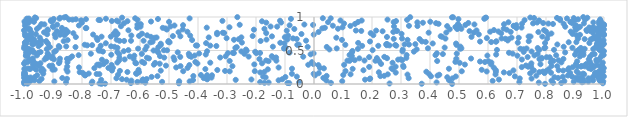
| Category | Series 0 |
|---|---|
| 0.4761831762998169 | 0.001 |
| -0.7329986514179211 | 0.002 |
| 0.7966682588284687 | 0.003 |
| 0.37144371999010345 | 0.004 |
| -0.7204422965552445 | 0.005 |
| -0.9878403852070654 | 0.006 |
| -0.9994848018403928 | 0.007 |
| 0.2604854030135903 | 0.008 |
| -0.73987213595592 | 0.009 |
| -0.46590606559162245 | 0.01 |
| 0.9959589332955084 | 0.011 |
| -0.7665202800155161 | 0.012 |
| -0.08530954791465736 | 0.013 |
| -0.6313558976180087 | 0.014 |
| -0.0912273567869117 | 0.015 |
| 0.8528263923291615 | 0.016 |
| 0.05836148076472211 | 0.017 |
| -0.1708466229633781 | 0.018 |
| 0.8242678834732179 | 0.019 |
| -0.581791832935564 | 0.02 |
| 0.7752205158450862 | 0.021 |
| -0.1564035391496722 | 0.022 |
| -0.8550766626551991 | 0.023 |
| 0.42271016923232363 | 0.024 |
| -0.05116092716713912 | 0.025 |
| 0.9243784206409622 | 0.026 |
| -0.9824514071251189 | 0.027 |
| 0.7082492126752002 | 0.028 |
| -0.185692559574249 | 0.029 |
| -0.999760023621199 | 0.03 |
| -0.6091591608109762 | 0.031 |
| -0.523763712618865 | 0.032 |
| 0.8957545234421641 | 0.033 |
| 0.9913670706943317 | 0.034 |
| -0.7644074813029114 | 0.035 |
| 0.9462475688852203 | 0.036 |
| 0.9298903179635305 | 0.037 |
| -0.8954163408834829 | 0.038 |
| -0.42886680125371224 | 0.039 |
| 0.9974288219927818 | 0.04 |
| -0.46478855307577843 | 0.041 |
| 0.09733046694445732 | 0.042 |
| 0.8632538391992306 | 0.043 |
| -0.9471786104296015 | 0.044 |
| -0.5930293003872387 | 0.045 |
| 0.6159934723170785 | 0.046 |
| -0.9970303195276292 | 0.047 |
| 0.986025055725629 | 0.048 |
| 0.8189125498922989 | 0.049 |
| 0.9857532486220307 | 0.05 |
| -0.6297396460346989 | 0.051 |
| 0.04284983580984073 | 0.052 |
| 0.9624437330770488 | 0.053 |
| -0.9937856427482125 | 0.054 |
| -0.12203281544834287 | 0.055 |
| -0.9637853088101777 | 0.056 |
| -0.9778437793319744 | 0.057 |
| 0.46541270220072084 | 0.058 |
| -0.41711559546450194 | 0.059 |
| -0.972833113934469 | 0.06 |
| 0.9111536025590282 | 0.061 |
| -0.26998520431598727 | 0.062 |
| -0.7339309547691629 | 0.063 |
| -0.646077258375811 | 0.064 |
| 0.17606115929904165 | 0.065 |
| 0.6376716791051156 | 0.066 |
| -0.2157930610928328 | 0.067 |
| 0.9289047558855776 | 0.068 |
| -0.5896846106075215 | 0.069 |
| -0.3681103411656226 | 0.07 |
| -0.10958303658361723 | 0.071 |
| -0.6620163133492162 | 0.072 |
| 0.19222562209718472 | 0.073 |
| -0.5771105123574439 | 0.074 |
| 0.03864429112815712 | 0.075 |
| -0.9395453292824831 | 0.076 |
| 0.9165860711483595 | 0.077 |
| -0.8518050513418718 | 0.078 |
| -0.3707022948214637 | 0.079 |
| 0.9812227290836602 | 0.08 |
| 0.7502742281436123 | 0.081 |
| 0.1935894977928654 | 0.082 |
| 0.7095136758854254 | 0.083 |
| 0.4775279987565999 | 0.084 |
| 0.9465589956881737 | 0.085 |
| -0.6813483223023441 | 0.086 |
| 0.3264322341426441 | 0.087 |
| -0.3805272361320704 | 0.088 |
| -0.8679311445318502 | 0.089 |
| 0.8417354414630579 | 0.09 |
| 0.03228903532206172 | 0.091 |
| -0.9997832725576027 | 0.092 |
| 0.9047147122110147 | 0.093 |
| 0.9214486737378619 | 0.094 |
| 0.984737941856761 | 0.095 |
| -0.3535149148617646 | 0.096 |
| -0.37325535563498324 | 0.097 |
| -0.9776566715709399 | 0.098 |
| -0.16674908321853327 | 0.099 |
| -0.9895901991297454 | 0.1 |
| 0.45953455066003734 | 0.101 |
| 0.8291885957812994 | 0.102 |
| 0.9908680996945638 | 0.103 |
| -0.09867518161428987 | 0.104 |
| -0.9622856707149862 | 0.105 |
| -0.5599580877103342 | 0.106 |
| 0.9620528589195871 | 0.107 |
| 0.8581982435547091 | 0.108 |
| 0.8905720276092235 | 0.109 |
| -0.05918608183319486 | 0.11 |
| -0.17528077530618372 | 0.111 |
| 0.4888791612872844 | 0.112 |
| 0.9997155733761289 | 0.113 |
| 0.6926380203865318 | 0.114 |
| 0.4033890295120972 | 0.115 |
| 0.9937576478370104 | 0.116 |
| -0.5398063972521128 | 0.117 |
| 0.22885650312958136 | 0.118 |
| -0.41608056219324396 | 0.119 |
| 0.9753262769781552 | 0.12 |
| 0.043533114074172034 | 0.121 |
| 0.2420615800512091 | 0.122 |
| -0.9987405920900825 | 0.123 |
| 0.7667499288293764 | 0.124 |
| 0.4259458958878123 | 0.125 |
| 0.983807514614296 | 0.126 |
| 0.8756596580170646 | 0.127 |
| -0.7894879970519679 | 0.128 |
| 0.003157342298338111 | 0.129 |
| -0.35181812935736634 | 0.13 |
| -0.9543116406598348 | 0.131 |
| -0.36864580558583687 | 0.132 |
| -0.7879312094433999 | 0.133 |
| -0.3898584680991907 | 0.134 |
| 0.1009181065340484 | 0.135 |
| -0.9997297444392703 | 0.136 |
| -0.675834703131482 | 0.137 |
| 0.432056004073973 | 0.138 |
| -0.7914860766390865 | 0.139 |
| 0.9913522891222154 | 0.14 |
| 0.322419122605591 | 0.141 |
| 0.6259622933719761 | 0.142 |
| -0.9982733126193035 | 0.143 |
| 0.25435478227383435 | 0.144 |
| 0.12607630086835622 | 0.145 |
| 0.931571928398996 | 0.146 |
| 0.39718772374604294 | 0.147 |
| -0.7400940967995704 | 0.148 |
| -0.7495227744906634 | 0.149 |
| -0.9968058334296133 | 0.15 |
| -0.6116288900324692 | 0.151 |
| -0.07617494987491896 | 0.152 |
| -0.0012678405105899172 | 0.153 |
| -0.933598720870026 | 0.154 |
| 0.9277741454292663 | 0.155 |
| -0.7768890470134003 | 0.156 |
| 0.9131282964480276 | 0.157 |
| 0.9696315632561494 | 0.158 |
| 0.7453965260359935 | 0.159 |
| -0.6135832855017107 | 0.16 |
| 0.016323874044336315 | 0.161 |
| 0.6739067085137224 | 0.162 |
| 0.7947222123990226 | 0.163 |
| 0.9696406764794585 | 0.164 |
| 0.8833749066618113 | 0.165 |
| -0.7974207652328303 | 0.166 |
| -0.999828649015598 | 0.167 |
| 0.8171457229405508 | 0.168 |
| -0.9969865925332445 | 0.169 |
| 0.2818342657028766 | 0.17 |
| 0.977764012232279 | 0.171 |
| -0.18540631049015135 | 0.172 |
| 0.654782376966808 | 0.173 |
| 0.9876685586733224 | 0.174 |
| 0.22359172078187278 | 0.175 |
| -0.6033996280788666 | 0.176 |
| -0.8079421705603181 | 0.177 |
| 0.7771959336108175 | 0.178 |
| -0.643351077055844 | 0.179 |
| 0.981136088498957 | 0.18 |
| 0.627152578700658 | 0.181 |
| -0.17098441525530614 | 0.182 |
| 0.38740509093550846 | 0.183 |
| 0.997368913605474 | 0.184 |
| -0.8499887791747857 | 0.185 |
| 0.7896608531812931 | 0.186 |
| 0.595509256246034 | 0.187 |
| 0.9060169626462575 | 0.188 |
| -0.29064699320295745 | 0.189 |
| 0.5095206542109393 | 0.19 |
| -0.450994228629285 | 0.191 |
| -0.20420383544142992 | 0.192 |
| 0.10875116749014609 | 0.193 |
| 0.8008348095232855 | 0.194 |
| -0.3066643096013989 | 0.195 |
| -0.6692139718307759 | 0.196 |
| -0.9407950444282374 | 0.197 |
| 0.7549076359853384 | 0.198 |
| -0.528461823414676 | 0.199 |
| 0.8592926797957788 | 0.2 |
| -0.6965819908749893 | 0.201 |
| -0.9326734664798678 | 0.202 |
| 0.6877430185881594 | 0.203 |
| 0.758144520326045 | 0.204 |
| 0.17048389069232564 | 0.205 |
| 0.8436527335064744 | 0.206 |
| 0.6269084366790422 | 0.207 |
| 0.988347068351267 | 0.208 |
| -0.3333561604930616 | 0.209 |
| 0.9899929269152165 | 0.21 |
| -0.6050796657222637 | 0.211 |
| 0.578413415947004 | 0.212 |
| 0.8755093637585766 | 0.213 |
| -0.901675845924826 | 0.214 |
| -0.9584349479465668 | 0.215 |
| -0.8941275922083625 | 0.216 |
| -0.8534735170445825 | 0.217 |
| -0.9980693160747067 | 0.218 |
| -0.15927026159234056 | 0.219 |
| 0.809072802083074 | 0.22 |
| 0.27187818346145637 | 0.221 |
| 0.9924178229444289 | 0.222 |
| -0.3746534612663579 | 0.223 |
| 0.9554042163887956 | 0.224 |
| -0.978432096881985 | 0.225 |
| 0.13326676660470668 | 0.226 |
| -0.980670916206796 | 0.227 |
| 0.46521111119062836 | 0.228 |
| -0.07581918105990904 | 0.229 |
| -0.9982872771745571 | 0.23 |
| -0.9386924206356975 | 0.231 |
| -0.9862159631142043 | 0.232 |
| 0.26739785673355826 | 0.233 |
| 0.03410259756347183 | 0.234 |
| 0.8786046033859508 | 0.235 |
| 0.9477974199959928 | 0.236 |
| -0.7573725514416487 | 0.237 |
| 0.9993522587638082 | 0.238 |
| -0.7088915438968117 | 0.239 |
| -0.43595744261162644 | 0.24 |
| 0.020508749598327165 | 0.241 |
| -0.6933511225652733 | 0.242 |
| -0.966396002587965 | 0.243 |
| 0.6199022416698853 | 0.244 |
| 0.9636405619653363 | 0.245 |
| -0.12200328353689766 | 0.246 |
| -0.4751854176024953 | 0.247 |
| -0.8103154471395149 | 0.248 |
| 0.9577423310882203 | 0.249 |
| 0.9549213287849497 | 0.25 |
| 0.8919376800167702 | 0.251 |
| 0.7165018991743688 | 0.252 |
| -0.9034982519841863 | 0.253 |
| 0.3088467807952517 | 0.254 |
| 0.1902456277311152 | 0.255 |
| 0.7486582663116449 | 0.256 |
| 0.989903454090355 | 0.257 |
| 0.7385250959367755 | 0.258 |
| 0.2815187108591942 | 0.259 |
| 0.9207891145772515 | 0.26 |
| 0.9088226298433976 | 0.261 |
| -0.8509755587358987 | 0.262 |
| 0.9339927266080089 | 0.263 |
| 0.9943343185194059 | 0.264 |
| 0.8387494287613166 | 0.265 |
| -0.28123455396882396 | 0.266 |
| -0.4602183229786577 | 0.267 |
| 0.964687592346072 | 0.268 |
| 0.9229024767514014 | 0.269 |
| 0.819043869409086 | 0.27 |
| -0.9120459558025976 | 0.271 |
| 0.3075158917550577 | 0.272 |
| -0.948884727009474 | 0.273 |
| -0.5105151393972445 | 0.274 |
| -0.9028306953060808 | 0.275 |
| 0.7307904115347575 | 0.276 |
| -0.7391830419453883 | 0.277 |
| 0.7464592898023614 | 0.278 |
| 0.9914596136601084 | 0.279 |
| 0.9766372046814199 | 0.28 |
| 0.9916399651944607 | 0.281 |
| 0.014972784646921757 | 0.282 |
| -0.42976118963834 | 0.283 |
| -0.6979711206059357 | 0.284 |
| 0.9357335856043774 | 0.285 |
| 0.1038887967725663 | 0.286 |
| -0.01976369355939126 | 0.287 |
| -0.7475834634277243 | 0.288 |
| -0.5521845126177011 | 0.289 |
| 0.5203050797325081 | 0.29 |
| -0.7406960012939775 | 0.291 |
| -0.20585832243460964 | 0.292 |
| 0.6106842944758568 | 0.293 |
| -0.9536616665201484 | 0.294 |
| 0.7808182617705149 | 0.295 |
| -0.9697569944006585 | 0.296 |
| -0.7257581542294915 | 0.297 |
| -0.002259492619621681 | 0.298 |
| 0.9035876783467656 | 0.299 |
| 0.23131965496950824 | 0.3 |
| 0.9393668587068903 | 0.301 |
| 0.9534783330809535 | 0.302 |
| -0.532021501493714 | 0.303 |
| -0.9982145857206014 | 0.304 |
| -0.9603779586867548 | 0.305 |
| -0.402019131603185 | 0.306 |
| -0.9995922902275469 | 0.307 |
| 0.7495298878837277 | 0.308 |
| -0.17914768153826235 | 0.309 |
| -0.6132594438695429 | 0.31 |
| -0.9431030250763994 | 0.311 |
| -0.879374330401693 | 0.312 |
| -0.5855144951243617 | 0.313 |
| -0.6159517158659251 | 0.314 |
| -0.5478348197970236 | 0.315 |
| 0.5024534542189008 | 0.316 |
| 0.2709108432444565 | 0.317 |
| -0.35767982717122154 | 0.318 |
| 0.9958121891555439 | 0.319 |
| -0.6781418262824486 | 0.32 |
| 0.6116820578339064 | 0.321 |
| 0.8529632541799282 | 0.322 |
| -0.9666494829986769 | 0.323 |
| 0.8163899678957484 | 0.324 |
| -0.8499848802092131 | 0.325 |
| -0.007138915755086702 | 0.326 |
| -0.9877199896874622 | 0.327 |
| 0.5894060000268831 | 0.328 |
| -0.4091413148004673 | 0.329 |
| 0.4875424346652088 | 0.33 |
| -0.5926823537242355 | 0.331 |
| -0.7161659431853717 | 0.332 |
| 0.9513824480088159 | 0.333 |
| -0.9953550015369362 | 0.334 |
| 0.5725001659542602 | 0.335 |
| 0.9742175842458151 | 0.336 |
| 0.9076401317372782 | 0.337 |
| -0.9694718608639032 | 0.338 |
| -0.8772407464790076 | 0.339 |
| 0.6015139471261898 | 0.34 |
| -0.15665483057567262 | 0.341 |
| 0.22422223042871875 | 0.342 |
| 0.42478522758176473 | 0.343 |
| -0.29068768919873866 | 0.344 |
| 0.8257843734139976 | 0.345 |
| 0.123005486869125 | 0.346 |
| 0.21187650905022073 | 0.347 |
| -0.1298235197018101 | 0.348 |
| 0.1150863243600722 | 0.349 |
| 0.1740699280727343 | 0.35 |
| -0.16506307087969857 | 0.351 |
| -0.9795757262134235 | 0.352 |
| -0.6718543841267532 | 0.353 |
| 0.8430876652440076 | 0.354 |
| 0.3041307715665943 | 0.355 |
| 0.14061839683998612 | 0.356 |
| 0.8190529693763978 | 0.357 |
| 0.9826265208189364 | 0.358 |
| -0.48135538703554637 | 0.359 |
| -0.9703223731720885 | 0.36 |
| -0.9808023022722043 | 0.361 |
| 0.9736240556113851 | 0.362 |
| -0.7311442184133268 | 0.363 |
| 0.29018218928167083 | 0.364 |
| 0.7168670942298595 | 0.365 |
| -0.9288084262696672 | 0.366 |
| -0.6528596752144379 | 0.367 |
| 0.2989157395062863 | 0.368 |
| -0.8966512415377347 | 0.369 |
| 0.9475502717410647 | 0.37 |
| 0.7772392626170904 | 0.371 |
| 0.13024856694600276 | 0.372 |
| -0.1880296628013065 | 0.373 |
| 0.8600388349610076 | 0.374 |
| -0.8516535663017748 | 0.375 |
| 0.49061761270363663 | 0.376 |
| -0.6220984469424562 | 0.377 |
| 0.7849632739568472 | 0.378 |
| -0.876126206346728 | 0.379 |
| 0.5415874492872231 | 0.38 |
| -0.9698515081579733 | 0.381 |
| -0.5690817690391549 | 0.382 |
| 0.15643899575763098 | 0.383 |
| -0.8417907578572165 | 0.384 |
| 0.2518301227080493 | 0.385 |
| -0.9040523167132832 | 0.386 |
| 0.21694167239940843 | 0.387 |
| -0.9207702190312607 | 0.388 |
| 0.31833259831129035 | 0.389 |
| 0.7852777269481298 | 0.39 |
| -0.670931466584382 | 0.391 |
| -0.5762022305537695 | 0.392 |
| -0.14015958220628488 | 0.393 |
| -0.516414960026429 | 0.394 |
| -0.3234464584422746 | 0.395 |
| -0.1307880738549214 | 0.396 |
| -0.48420581493993414 | 0.397 |
| -0.9231260825605135 | 0.398 |
| 0.8126950397498263 | 0.399 |
| 0.802103316968603 | 0.4 |
| 0.19003982906850703 | 0.401 |
| 0.7367417882803656 | 0.402 |
| 0.9891146613230162 | 0.403 |
| -0.4611874147791786 | 0.404 |
| 0.24250487099188156 | 0.405 |
| -0.4230658798193523 | 0.406 |
| -0.0371303380352457 | 0.407 |
| 0.9518746469030154 | 0.408 |
| -0.225354640385823 | 0.409 |
| 0.9168029495600551 | 0.41 |
| -0.6352168106994392 | 0.411 |
| -0.8341104059281635 | 0.412 |
| -0.3047700502064982 | 0.413 |
| -0.902096157755025 | 0.414 |
| -0.145461957268507 | 0.415 |
| -0.5309983180888972 | 0.416 |
| -0.987588926960557 | 0.417 |
| -0.426599956241372 | 0.418 |
| 0.13044282223676315 | 0.419 |
| -0.430032640552454 | 0.42 |
| -0.9936060748394206 | 0.421 |
| 0.7014663117918339 | 0.422 |
| -0.6195722251837343 | 0.423 |
| 0.5978740072741515 | 0.424 |
| -0.4115897733500437 | 0.425 |
| 0.7600490773694305 | 0.426 |
| -0.9555226526875137 | 0.427 |
| -0.9925890962675544 | 0.428 |
| 0.8351226355912565 | 0.429 |
| -0.8116488681991132 | 0.43 |
| 0.41889273845797315 | 0.431 |
| 0.3194277853663662 | 0.432 |
| 0.9988729083293436 | 0.433 |
| 0.12263961435196905 | 0.434 |
| 0.9292577139990351 | 0.435 |
| 0.9934963105449697 | 0.436 |
| -0.6990867218899474 | 0.437 |
| 0.9001450670625539 | 0.438 |
| 0.6281157028728607 | 0.439 |
| -0.37322829958189174 | 0.44 |
| -0.9172141250397738 | 0.441 |
| 0.918513976130825 | 0.442 |
| -0.011711775754861079 | 0.443 |
| 0.9596612088774711 | 0.444 |
| -0.6718661712056394 | 0.445 |
| 0.9674753341384063 | 0.446 |
| 0.44438578351887875 | 0.447 |
| 0.7711569896944501 | 0.448 |
| -0.5937374685503112 | 0.449 |
| -0.23985161829740612 | 0.45 |
| -0.4316710411119765 | 0.451 |
| -0.7693635770412405 | 0.452 |
| 0.6850536904007426 | 0.453 |
| 0.4921654374789871 | 0.454 |
| -0.39603021234221214 | 0.455 |
| -0.918345473196697 | 0.456 |
| -0.0013812859015048182 | 0.457 |
| 0.42355863498955604 | 0.458 |
| -0.9876396530939693 | 0.459 |
| -0.2971548876805429 | 0.46 |
| -0.19920901098974902 | 0.461 |
| -0.27629459735738293 | 0.462 |
| -0.18592967278921277 | 0.463 |
| -0.9502822056827716 | 0.464 |
| -0.2797480266548156 | 0.465 |
| 0.6723294035404201 | 0.466 |
| -0.9928487171658718 | 0.467 |
| -0.08434749827562764 | 0.468 |
| -0.5370031749862862 | 0.469 |
| 0.9288798924141339 | 0.47 |
| 0.8661076183361963 | 0.471 |
| -0.9656000960276893 | 0.472 |
| -0.4699207074930344 | 0.473 |
| -0.9866514637543813 | 0.474 |
| -0.67814727858733 | 0.475 |
| 0.13136284850362562 | 0.476 |
| -0.9429301440373523 | 0.477 |
| -0.9791879177111774 | 0.478 |
| 0.7231384695592531 | 0.479 |
| -0.8955786584707964 | 0.48 |
| -0.20286457789328094 | 0.481 |
| 0.9243653075075686 | 0.482 |
| 0.3444843403533296 | 0.483 |
| -0.7277725016331832 | 0.484 |
| 0.7502230627327504 | 0.485 |
| -0.2503454332882388 | 0.486 |
| 0.30500832824753576 | 0.487 |
| 0.9047568832288354 | 0.488 |
| -0.36863168322692763 | 0.489 |
| -0.6557800870974838 | 0.49 |
| 0.993411478587261 | 0.491 |
| 0.9997195206550574 | 0.492 |
| 0.13239511098925688 | 0.493 |
| -0.9893505080560757 | 0.494 |
| -0.8901800228715547 | 0.495 |
| -0.23215746647993243 | 0.496 |
| -0.735758392672836 | 0.497 |
| -0.7421083246295427 | 0.498 |
| -0.5423209593389714 | 0.499 |
| -0.5533045808738302 | 0.5 |
| 0.9866226336396685 | 0.501 |
| -0.9879461745814979 | 0.502 |
| -0.5066154950219612 | 0.503 |
| -0.5175234886973222 | 0.504 |
| 0.20214607159893058 | 0.505 |
| -0.6400648865043037 | 0.506 |
| -0.971184549540461 | 0.507 |
| 0.7766063323782637 | 0.508 |
| 0.6309505947437222 | 0.509 |
| 0.8276516742156439 | 0.51 |
| -0.9859346748828336 | 0.511 |
| 0.9130125319200322 | 0.512 |
| 0.30602637552585776 | 0.513 |
| -0.23452679123063647 | 0.514 |
| -0.5820819127771567 | 0.515 |
| 0.05329198160033928 | 0.516 |
| 0.35404641734657305 | 0.517 |
| -0.7424269016575393 | 0.518 |
| 0.7226639775121412 | 0.519 |
| 0.982327691011219 | 0.52 |
| -0.9214074270332652 | 0.521 |
| -0.9815632479213104 | 0.522 |
| 0.9630082988152198 | 0.523 |
| 0.15147339050333708 | 0.524 |
| 0.9334107343440672 | 0.525 |
| 0.711471235736657 | 0.526 |
| 0.5040919662500177 | 0.527 |
| -0.6065580955623024 | 0.528 |
| -0.10351751751581025 | 0.529 |
| 0.733114407678123 | 0.53 |
| 0.07832045789376355 | 0.531 |
| 0.5081859483560387 | 0.532 |
| 0.39284660488091827 | 0.533 |
| -0.9998712710856422 | 0.534 |
| 0.7941248772434557 | 0.535 |
| -0.9899670484617196 | 0.536 |
| 0.7714779932095128 | 0.537 |
| 0.9201139690750318 | 0.538 |
| -0.27125012776908247 | 0.539 |
| -0.6777295123189343 | 0.54 |
| 0.8908803699402563 | 0.541 |
| 0.7975269401422791 | 0.542 |
| -0.09758847514167146 | 0.543 |
| 0.45057656115772626 | 0.544 |
| 0.9886837588342673 | 0.545 |
| -0.10133034219885882 | 0.546 |
| 0.9729501119247523 | 0.547 |
| -0.8780128245726565 | 0.548 |
| -0.5368302426876802 | 0.549 |
| -0.2663314230179611 | 0.55 |
| -0.8224561750009676 | 0.551 |
| -0.9109196773748393 | 0.552 |
| 0.0440642902239774 | 0.553 |
| -0.021773293622553324 | 0.554 |
| -0.6874419700158794 | 0.555 |
| 0.8609882509466815 | 0.556 |
| -0.1417991571215311 | 0.557 |
| 0.5048924134584483 | 0.558 |
| -0.5769949659361127 | 0.559 |
| 0.97289342667542 | 0.56 |
| -0.8543730430385267 | 0.561 |
| -0.6996624210966276 | 0.562 |
| -0.9988359003709271 | 0.563 |
| -0.9498332004857044 | 0.564 |
| 0.9918511350939324 | 0.565 |
| -0.8800319932233975 | 0.566 |
| -0.3366822704063421 | 0.567 |
| 0.9888168332364358 | 0.568 |
| 0.166026094934711 | 0.569 |
| 0.2216359271104735 | 0.57 |
| -0.7354147188237938 | 0.571 |
| 0.2839219467030553 | 0.572 |
| -0.3577785797633996 | 0.573 |
| -0.4027221847387586 | 0.574 |
| -0.40716626579439763 | 0.575 |
| 0.2605091224373943 | 0.576 |
| -0.7819512826846929 | 0.577 |
| 0.9949598771824604 | 0.578 |
| 0.2508554513514658 | 0.579 |
| -0.7650177976003507 | 0.58 |
| -0.5283456344208903 | 0.581 |
| 0.27996522418847336 | 0.582 |
| 0.4917232663171862 | 0.583 |
| -0.05764134039047302 | 0.584 |
| 0.10802440143759065 | 0.585 |
| -0.790761827130492 | 0.586 |
| 0.9765992749312297 | 0.587 |
| -0.05264946172941195 | 0.588 |
| 0.3274980287705644 | 0.589 |
| 0.8390917429941473 | 0.59 |
| -0.9952312042431767 | 0.591 |
| 0.3125626025333079 | 0.592 |
| 0.2488095489129894 | 0.593 |
| -0.9691502065567884 | 0.594 |
| 0.34936250969488447 | 0.595 |
| -0.9420458684210773 | 0.596 |
| 0.2519989039961231 | 0.597 |
| 0.9998409221520342 | 0.598 |
| -0.9722270591590637 | 0.599 |
| 0.9756150963467195 | 0.6 |
| -0.5284407434887707 | 0.601 |
| -0.9655641576914931 | 0.602 |
| -0.9172412149316336 | 0.603 |
| 0.4898348014325527 | 0.604 |
| 0.409430492661633 | 0.605 |
| 0.9798394851297336 | 0.606 |
| -0.10183621268703974 | 0.607 |
| -0.717839683819419 | 0.608 |
| -0.9920628512272185 | 0.609 |
| -0.3721027735390717 | 0.61 |
| 0.9495364858846679 | 0.611 |
| 0.7967825970119985 | 0.612 |
| 0.1523161526171778 | 0.613 |
| -0.9939520427504588 | 0.614 |
| -0.11623853211220676 | 0.615 |
| -0.9962010803666914 | 0.616 |
| 0.7026829473158226 | 0.617 |
| -0.24859333265166 | 0.618 |
| -0.9968214639680006 | 0.619 |
| -0.9514028179392561 | 0.62 |
| -0.5643385032975846 | 0.621 |
| -0.4978778546376608 | 0.622 |
| 0.8782593655154872 | 0.623 |
| 0.9884541720944197 | 0.624 |
| 0.904686424073134 | 0.625 |
| 0.6110794387377207 | 0.626 |
| -0.5023534874160323 | 0.627 |
| 0.385390742881247 | 0.628 |
| -0.9938255494747313 | 0.629 |
| -0.5567523293238269 | 0.63 |
| 0.6271601651201952 | 0.631 |
| 0.9956560234793301 | 0.632 |
| 0.5725895887810203 | 0.633 |
| 0.1930159075004333 | 0.634 |
| 0.37230662134745185 | 0.635 |
| -0.9235954993967116 | 0.636 |
| 0.6291095423572061 | 0.637 |
| -0.9233887166201824 | 0.638 |
| 0.7405067397576894 | 0.639 |
| -0.8631216866445992 | 0.64 |
| -0.5016008686345208 | 0.641 |
| -0.1839924507929315 | 0.642 |
| -0.6546576236523425 | 0.643 |
| -0.6703955806977206 | 0.644 |
| -0.630993879472945 | 0.645 |
| -0.5876999958107065 | 0.646 |
| -0.027360094858948105 | 0.647 |
| -0.9400749000653672 | 0.648 |
| -0.9666578034349315 | 0.649 |
| 0.6679775609416894 | 0.65 |
| -0.9711577825978668 | 0.651 |
| -0.9679465789315567 | 0.652 |
| 0.9983633448910308 | 0.653 |
| -0.9861605050003661 | 0.654 |
| -0.8496739448199787 | 0.655 |
| -0.4203515474415308 | 0.656 |
| -0.7464937171122977 | 0.657 |
| 0.0964218478698417 | 0.658 |
| 0.3224314900443841 | 0.659 |
| -0.2758548817918047 | 0.66 |
| -0.6804234084993175 | 0.661 |
| 0.9747597365215841 | 0.662 |
| -0.16382195374651834 | 0.663 |
| -0.09156752575583844 | 0.664 |
| 0.9537157708296738 | 0.665 |
| -0.9655119202009498 | 0.666 |
| 0.6703026385900261 | 0.667 |
| -0.2597836027798849 | 0.668 |
| -0.9766650527667493 | 0.669 |
| 0.9333587393983315 | 0.67 |
| 0.36409552204860146 | 0.671 |
| -0.05964235772782475 | 0.672 |
| 0.9590121473110732 | 0.673 |
| 0.2749274522575319 | 0.674 |
| 0.6597844981118293 | 0.675 |
| 0.9104676947183361 | 0.676 |
| 0.8037984282522035 | 0.677 |
| 0.45324761045164963 | 0.678 |
| 0.30354850731938754 | 0.679 |
| 0.6467214981638143 | 0.68 |
| -0.07219117696931014 | 0.681 |
| 0.9836921826777796 | 0.682 |
| 0.9659460956697081 | 0.683 |
| -0.30135450204428776 | 0.684 |
| 0.5960250754530709 | 0.685 |
| -0.7494790903028825 | 0.686 |
| -0.9728087128446531 | 0.687 |
| 0.9633094717054603 | 0.688 |
| -0.5494167987171575 | 0.689 |
| 0.7060456864944779 | 0.69 |
| 0.0769689822037695 | 0.691 |
| 0.6813040322913237 | 0.692 |
| -0.945615012479907 | 0.693 |
| -0.5428744457611895 | 0.694 |
| -0.3629878268882526 | 0.695 |
| -0.2505190222303726 | 0.696 |
| -0.8912559670042054 | 0.697 |
| -0.9875022875598771 | 0.698 |
| -0.10061144136302039 | 0.699 |
| -0.9819451250544446 | 0.7 |
| -0.8213013099860965 | 0.701 |
| 0.2516151156941164 | 0.702 |
| 0.5431089107254238 | 0.703 |
| -0.5625344471533185 | 0.704 |
| 0.4414160808090019 | 0.705 |
| -0.7325258539160658 | 0.706 |
| -0.7006942473496118 | 0.707 |
| 0.7872616742625125 | 0.708 |
| 0.7467208766717135 | 0.709 |
| 0.7400552431353158 | 0.71 |
| -0.14494301288976721 | 0.711 |
| -0.46077336891871357 | 0.712 |
| 0.4369410023179479 | 0.713 |
| 0.9771131195867361 | 0.714 |
| -0.48655869269793994 | 0.715 |
| -0.21150071780391408 | 0.716 |
| -0.9854224796261962 | 0.717 |
| -0.6032737850636313 | 0.718 |
| -0.9940974820720764 | 0.719 |
| -0.9828572837188622 | 0.72 |
| -0.08936732987642172 | 0.721 |
| -0.42699550029720923 | 0.722 |
| -0.9962149580951456 | 0.723 |
| -0.6299331456843312 | 0.724 |
| -0.8604444002075601 | 0.725 |
| 0.9062152926158858 | 0.726 |
| -0.575329765698773 | 0.727 |
| 0.9991088203918924 | 0.728 |
| 0.20461079540088695 | 0.729 |
| -0.6836970898810562 | 0.73 |
| -0.976131919679226 | 0.731 |
| 0.983835317418583 | 0.732 |
| 0.9996959345346386 | 0.733 |
| 0.9171551832417854 | 0.734 |
| -0.8755715673816248 | 0.735 |
| 0.8082699002140827 | 0.736 |
| -0.000948233164462918 | 0.737 |
| -0.7616091185194093 | 0.738 |
| -0.8939126511322384 | 0.739 |
| 0.5682907682281175 | 0.74 |
| -0.6798794060439897 | 0.741 |
| -0.9203360113640328 | 0.742 |
| -0.3341866916063563 | 0.743 |
| 0.9998853376719019 | 0.744 |
| -0.9589333410263334 | 0.745 |
| -0.04329655613817608 | 0.746 |
| 0.8920847639161512 | 0.747 |
| -0.6908483827073649 | 0.748 |
| 0.30194312831839165 | 0.749 |
| -0.677468156444023 | 0.75 |
| -0.5931055571380349 | 0.751 |
| -0.9969859979147119 | 0.752 |
| 0.9946680863096151 | 0.753 |
| 0.818613953206414 | 0.754 |
| -0.855245451509076 | 0.755 |
| 0.9633293497315134 | 0.756 |
| 0.645397448519818 | 0.757 |
| -0.8297951549144916 | 0.758 |
| 0.19551268682728107 | 0.759 |
| -0.16479200481850728 | 0.76 |
| -0.30988031129281485 | 0.761 |
| 0.8902341448675418 | 0.762 |
| 0.9824237148609236 | 0.763 |
| -0.33415036996174896 | 0.764 |
| -0.3146915588287571 | 0.765 |
| 0.3953505298703132 | 0.766 |
| 0.5514654386400146 | 0.767 |
| 0.45624506795695596 | 0.768 |
| 0.9959181693436973 | 0.769 |
| 0.981149496559775 | 0.77 |
| -0.9308101674850098 | 0.771 |
| -0.4670825617852332 | 0.772 |
| 0.9835720727329732 | 0.773 |
| -0.9753998477277545 | 0.774 |
| 0.773654422389404 | 0.775 |
| 0.01574481710765127 | 0.776 |
| 0.2735082414888781 | 0.777 |
| 0.6782765779948391 | 0.778 |
| -0.8488125175079171 | 0.779 |
| -0.4364440616389733 | 0.78 |
| 0.6077021119570559 | 0.781 |
| 0.8852408562656523 | 0.782 |
| 0.800281495151909 | 0.783 |
| 0.6359400699820358 | 0.784 |
| -0.8705392098227079 | 0.785 |
| -0.6842974462810228 | 0.786 |
| 0.2365003498928904 | 0.787 |
| -0.8866106228300874 | 0.788 |
| 0.5362140684417012 | 0.789 |
| 0.9532738995248335 | 0.79 |
| 0.9409860862579839 | 0.791 |
| 0.16297885718471433 | 0.792 |
| 0.2862101642117285 | 0.793 |
| 0.9931349111940713 | 0.794 |
| 0.2846659825241854 | 0.795 |
| -0.0938928142419573 | 0.796 |
| 0.21424637401991514 | 0.797 |
| 0.1444496153302499 | 0.798 |
| -0.9180528234036807 | 0.799 |
| 0.5604612150389443 | 0.8 |
| -0.9999577564817411 | 0.801 |
| -0.6398802459306907 | 0.802 |
| 0.955064943078526 | 0.803 |
| 0.7931971774869252 | 0.804 |
| 0.6205078173357076 | 0.805 |
| 0.9393524365656035 | 0.806 |
| 0.9020451130396734 | 0.807 |
| -0.855501676067124 | 0.808 |
| 0.9894115752166971 | 0.809 |
| 0.6645411886774478 | 0.81 |
| -0.20717695901595923 | 0.811 |
| 0.9699973717785397 | 0.812 |
| -0.5073580990749572 | 0.813 |
| -0.9187524246982948 | 0.814 |
| -0.45257058360156155 | 0.815 |
| 0.4679693448398118 | 0.816 |
| 0.9999271409208128 | 0.817 |
| -0.9828554243289459 | 0.818 |
| -0.9796638954681472 | 0.819 |
| 0.4937515665564985 | 0.82 |
| -0.0678451691412645 | 0.821 |
| -0.9552135970224153 | 0.822 |
| -0.1709274227855492 | 0.823 |
| 0.5080974188553438 | 0.824 |
| 0.08273662400803428 | 0.825 |
| -0.9892258564290566 | 0.826 |
| 0.6542012610676229 | 0.827 |
| 0.9086666035529831 | 0.828 |
| -0.5122941141369854 | 0.829 |
| 0.9908703819199435 | 0.83 |
| 0.028709180814760697 | 0.831 |
| 0.984547049791912 | 0.832 |
| 0.9781673811878308 | 0.833 |
| -0.7869794118305692 | 0.834 |
| -0.7850560614857975 | 0.835 |
| 0.6979438576619502 | 0.836 |
| -0.8693058900446932 | 0.837 |
| -0.5215357339236848 | 0.838 |
| 0.0376183104447259 | 0.839 |
| -0.6094806320780627 | 0.84 |
| -0.3698527289874696 | 0.841 |
| 0.7156193523298693 | 0.842 |
| 0.9929996917409913 | 0.843 |
| 0.9490648216000855 | 0.844 |
| 0.9930205919467345 | 0.845 |
| 0.09834390082349578 | 0.846 |
| -0.29147245561602353 | 0.847 |
| 0.9006842183679553 | 0.848 |
| -0.8988474639803286 | 0.849 |
| 0.9631724847303573 | 0.85 |
| 0.9902305097702068 | 0.851 |
| 0.4875398485298632 | 0.852 |
| 0.9169894289102329 | 0.853 |
| -0.9468060161724879 | 0.854 |
| 0.8663685648858114 | 0.855 |
| -0.12705852065759218 | 0.856 |
| -0.5981657350027555 | 0.857 |
| -0.14960858826167941 | 0.858 |
| -0.4946074621911719 | 0.859 |
| 0.27588776079136124 | 0.86 |
| -0.9005942566172435 | 0.861 |
| -0.6655184320477655 | 0.862 |
| 0.6894026258657313 | 0.863 |
| 0.4591823794243025 | 0.864 |
| 0.356718841155145 | 0.865 |
| 0.5016131894456148 | 0.866 |
| 0.12551476768328362 | 0.867 |
| 0.3274508997878449 | 0.868 |
| 0.6885858739909466 | 0.869 |
| 0.06496291982473171 | 0.87 |
| -0.9968895164046959 | 0.871 |
| 0.9999957121206162 | 0.872 |
| -0.48115752529817646 | 0.873 |
| -0.8106612982590526 | 0.874 |
| 0.9036672552124188 | 0.875 |
| -0.08409748260965676 | 0.876 |
| 0.9972739372873296 | 0.877 |
| -0.4515530760661439 | 0.878 |
| 0.6977907918684895 | 0.879 |
| -0.6046473446722858 | 0.88 |
| 0.5219848455425631 | 0.881 |
| -0.0032018364050320778 | 0.882 |
| 0.9995813394237301 | 0.883 |
| -0.25618756181514996 | 0.884 |
| -0.8859145647781178 | 0.885 |
| -0.6089188279060928 | 0.886 |
| 0.9939846961933386 | 0.887 |
| -0.03327164687291299 | 0.888 |
| 0.5531049146651874 | 0.889 |
| -0.9296716729324803 | 0.89 |
| 0.9995958685419336 | 0.891 |
| 0.6552349850946365 | 0.892 |
| -0.5973809193708945 | 0.893 |
| -0.9402010629454024 | 0.894 |
| 0.4966723440215831 | 0.895 |
| 0.8240376758177549 | 0.896 |
| 0.14145429371818294 | 0.897 |
| 0.4295651802855567 | 0.898 |
| 0.8608153844701395 | 0.899 |
| 0.7174839545788387 | 0.9 |
| 0.9828101419542222 | 0.901 |
| 0.8081799771833191 | 0.902 |
| 0.10363845816088572 | 0.903 |
| 0.9305366593609192 | 0.904 |
| 0.7553808185787051 | 0.905 |
| -0.6552714589552879 | 0.906 |
| 0.8904281337685928 | 0.907 |
| 0.4208372862806611 | 0.908 |
| -0.9855290473931672 | 0.909 |
| 0.7901355543615942 | 0.91 |
| 0.5321012410628463 | 0.911 |
| -0.9960786609947739 | 0.912 |
| -0.9925088254554708 | 0.913 |
| 0.37556867129943766 | 0.914 |
| -0.8001250983512247 | 0.915 |
| -0.16459263351476458 | 0.916 |
| -0.11325948739641531 | 0.917 |
| 0.7696209924701315 | 0.918 |
| 0.9633627793850902 | 0.919 |
| 0.35639738674396226 | 0.92 |
| 0.6704509576175821 | 0.921 |
| 0.8869298204003347 | 0.922 |
| 0.04849571997964931 | 0.923 |
| 0.27475128802946475 | 0.924 |
| 0.15182138136668974 | 0.925 |
| 0.8840758008432247 | 0.926 |
| -0.4998525812108211 | 0.927 |
| -0.9655860708755774 | 0.928 |
| 0.40100332412771006 | 0.929 |
| 0.9824599313792357 | 0.93 |
| -0.6744967768292804 | 0.931 |
| -0.5619648767706065 | 0.932 |
| -0.9984140135098737 | 0.933 |
| -0.9928914121641829 | 0.934 |
| 0.9895338634490367 | 0.935 |
| -0.17934884060408013 | 0.936 |
| -0.643207039710385 | 0.937 |
| -0.9069485507920125 | 0.938 |
| 0.2828970955959257 | 0.939 |
| -0.6969907079358657 | 0.94 |
| -0.9007516223410198 | 0.941 |
| -0.3157738479931071 | 0.942 |
| -0.9719985682947269 | 0.943 |
| -0.11705879814166181 | 0.944 |
| -0.9928241237823259 | 0.945 |
| -0.6803988221419275 | 0.946 |
| 0.16442929916796709 | 0.947 |
| 0.09115464832065608 | 0.948 |
| 0.7761680940759842 | 0.949 |
| -0.8031019235952847 | 0.95 |
| -0.9075045891174813 | 0.951 |
| 0.8488628987650604 | 0.952 |
| 0.7260933202605613 | 0.953 |
| -0.7377632367162653 | 0.954 |
| 0.9004062280351711 | 0.955 |
| -0.7426775311088796 | 0.956 |
| 0.32103210311571384 | 0.957 |
| -0.6088689971233328 | 0.958 |
| 0.9347649440981817 | 0.959 |
| -0.8325135064465868 | 0.96 |
| 0.2535143946699506 | 0.961 |
| -0.8447261873896742 | 0.962 |
| -0.9848995141880864 | 0.963 |
| 0.9869070718305277 | 0.964 |
| 0.9104995475987265 | 0.965 |
| -0.8210843074197121 | 0.966 |
| -0.7863802414600002 | 0.967 |
| 0.49802187955955085 | 0.968 |
| 0.8483397455984193 | 0.969 |
| -0.5380134414016436 | 0.97 |
| -0.8974763113248537 | 0.971 |
| -0.07945180909988618 | 0.972 |
| 0.5871858424581679 | 0.973 |
| -0.7175125905988645 | 0.974 |
| -0.8777839019477743 | 0.975 |
| -0.9897700138282619 | 0.976 |
| -0.9831933270454194 | 0.977 |
| 0.8722862326492351 | 0.978 |
| -0.4288966042207616 | 0.979 |
| 0.05762629155930565 | 0.98 |
| -0.6167049248367571 | 0.981 |
| 0.03046070121738982 | 0.982 |
| -0.9581710712178788 | 0.983 |
| 0.8958277411562496 | 0.984 |
| 0.7587858798286726 | 0.985 |
| 0.8379656031568643 | 0.986 |
| 0.5901292844324436 | 0.987 |
| -0.8756422799085064 | 0.988 |
| 0.9425748891138164 | 0.989 |
| -0.6618408575023806 | 0.99 |
| 0.593350579196547 | 0.991 |
| 0.7457603070223463 | 0.992 |
| -0.8616868126862052 | 0.993 |
| -0.9623740038696219 | 0.994 |
| 0.47578915512651465 | 0.995 |
| 0.479772777870806 | 0.996 |
| 0.33175033541841326 | 0.997 |
| -0.2643623075173997 | 0.998 |
| 0.9283906806735425 | 0.999 |
| -0.8555628956043564 | 1 |